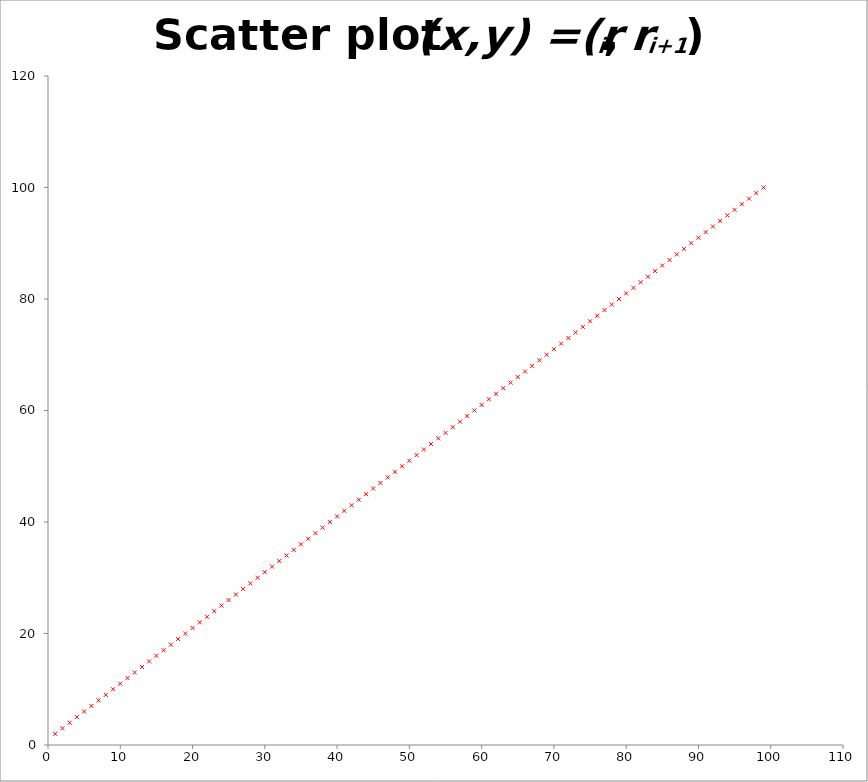
| Category | Scatter plot (x,y) =(ri, ri+1)   |
|---|---|
| 1.0 | 2 |
| 2.0 | 3 |
| 3.0 | 4 |
| 4.0 | 5 |
| 5.0 | 6 |
| 6.0 | 7 |
| 7.0 | 8 |
| 8.0 | 9 |
| 9.0 | 10 |
| 10.0 | 11 |
| 11.0 | 12 |
| 12.0 | 13 |
| 13.0 | 14 |
| 14.0 | 15 |
| 15.0 | 16 |
| 16.0 | 17 |
| 17.0 | 18 |
| 18.0 | 19 |
| 19.0 | 20 |
| 20.0 | 21 |
| 21.0 | 22 |
| 22.0 | 23 |
| 23.0 | 24 |
| 24.0 | 25 |
| 25.0 | 26 |
| 26.0 | 27 |
| 27.0 | 28 |
| 28.0 | 29 |
| 29.0 | 30 |
| 30.0 | 31 |
| 31.0 | 32 |
| 32.0 | 33 |
| 33.0 | 34 |
| 34.0 | 35 |
| 35.0 | 36 |
| 36.0 | 37 |
| 37.0 | 38 |
| 38.0 | 39 |
| 39.0 | 40 |
| 40.0 | 41 |
| 41.0 | 42 |
| 42.0 | 43 |
| 43.0 | 44 |
| 44.0 | 45 |
| 45.0 | 46 |
| 46.0 | 47 |
| 47.0 | 48 |
| 48.0 | 49 |
| 49.0 | 50 |
| 50.0 | 51 |
| 51.0 | 52 |
| 52.0 | 53 |
| 53.0 | 54 |
| 54.0 | 55 |
| 55.0 | 56 |
| 56.0 | 57 |
| 57.0 | 58 |
| 58.0 | 59 |
| 59.0 | 60 |
| 60.0 | 61 |
| 61.0 | 62 |
| 62.0 | 63 |
| 63.0 | 64 |
| 64.0 | 65 |
| 65.0 | 66 |
| 66.0 | 67 |
| 67.0 | 68 |
| 68.0 | 69 |
| 69.0 | 70 |
| 70.0 | 71 |
| 71.0 | 72 |
| 72.0 | 73 |
| 73.0 | 74 |
| 74.0 | 75 |
| 75.0 | 76 |
| 76.0 | 77 |
| 77.0 | 78 |
| 78.0 | 79 |
| 79.0 | 80 |
| 80.0 | 81 |
| 81.0 | 82 |
| 82.0 | 83 |
| 83.0 | 84 |
| 84.0 | 85 |
| 85.0 | 86 |
| 86.0 | 87 |
| 87.0 | 88 |
| 88.0 | 89 |
| 89.0 | 90 |
| 90.0 | 91 |
| 91.0 | 92 |
| 92.0 | 93 |
| 93.0 | 94 |
| 94.0 | 95 |
| 95.0 | 96 |
| 96.0 | 97 |
| 97.0 | 98 |
| 98.0 | 99 |
| 99.0 | 100 |